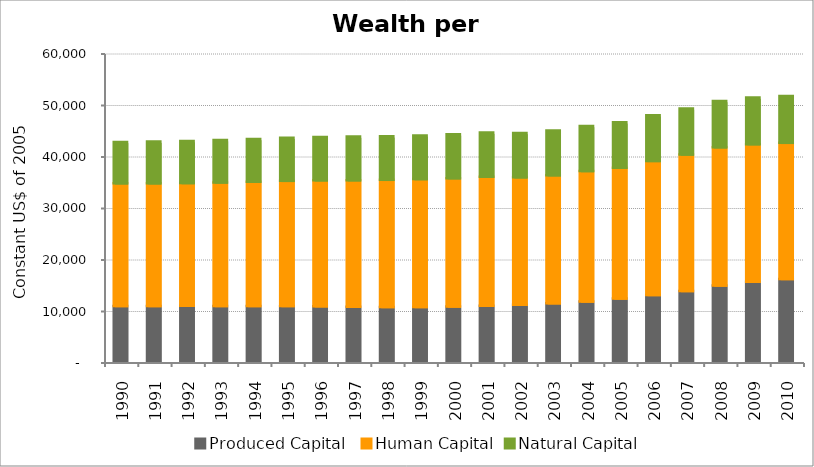
| Category | Produced Capital  | Human Capital | Natural Capital |
|---|---|---|---|
| 1990.0 | 10819.14 | 23832.734 | 8041.552 |
| 1991.0 | 10841.693 | 23812.396 | 8089.131 |
| 1992.0 | 10860.413 | 23836.867 | 8148.156 |
| 1993.0 | 10834.545 | 23993.878 | 8217.019 |
| 1994.0 | 10817.025 | 24147.565 | 8295.323 |
| 1995.0 | 10843.281 | 24281.672 | 8360.134 |
| 1996.0 | 10787.708 | 24447.241 | 8414.935 |
| 1997.0 | 10668.771 | 24584.22 | 8463.484 |
| 1998.0 | 10624.194 | 24707.708 | 8433.139 |
| 1999.0 | 10640.736 | 24823.334 | 8479.201 |
| 2000.0 | 10718.364 | 24933.91 | 8505.101 |
| 2001.0 | 10883.637 | 25046.117 | 8566.175 |
| 2002.0 | 11082.823 | 24735.601 | 8614.869 |
| 2003.0 | 11349.412 | 24874.767 | 8680.174 |
| 2004.0 | 11697.349 | 25337.003 | 8746.596 |
| 2005.0 | 12263.432 | 25419.919 | 8808.311 |
| 2006.0 | 12943.557 | 26057.322 | 8863.642 |
| 2007.0 | 13737.73 | 26509.508 | 8920.615 |
| 2008.0 | 14784.066 | 26866.755 | 8980.931 |
| 2009.0 | 15537.283 | 26719.041 | 9038.082 |
| 2010.0 | 16065.085 | 26446.832 | 9102.366 |